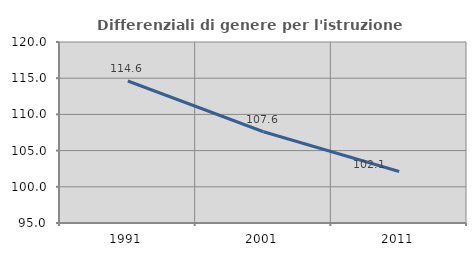
| Category | Differenziali di genere per l'istruzione superiore |
|---|---|
| 1991.0 | 114.611 |
| 2001.0 | 107.603 |
| 2011.0 | 102.12 |